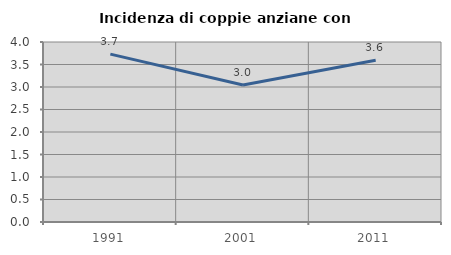
| Category | Incidenza di coppie anziane con figli |
|---|---|
| 1991.0 | 3.73 |
| 2001.0 | 3.046 |
| 2011.0 | 3.594 |